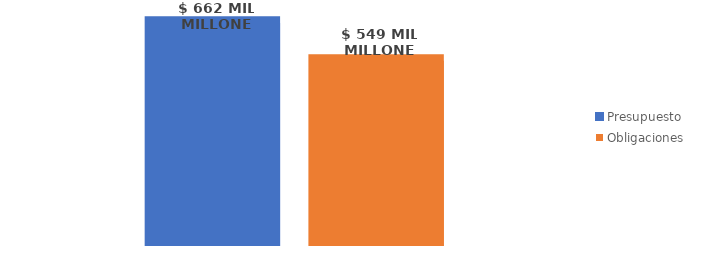
| Category | Presupuesto | Obligaciones |
|---|---|---|
| Total | 662264084416.597 | 549134078669.238 |